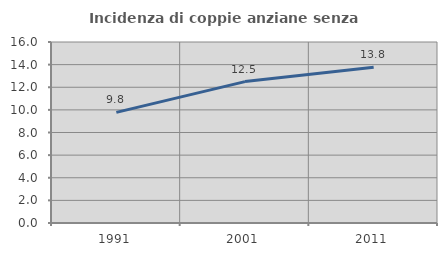
| Category | Incidenza di coppie anziane senza figli  |
|---|---|
| 1991.0 | 9.778 |
| 2001.0 | 12.5 |
| 2011.0 | 13.759 |